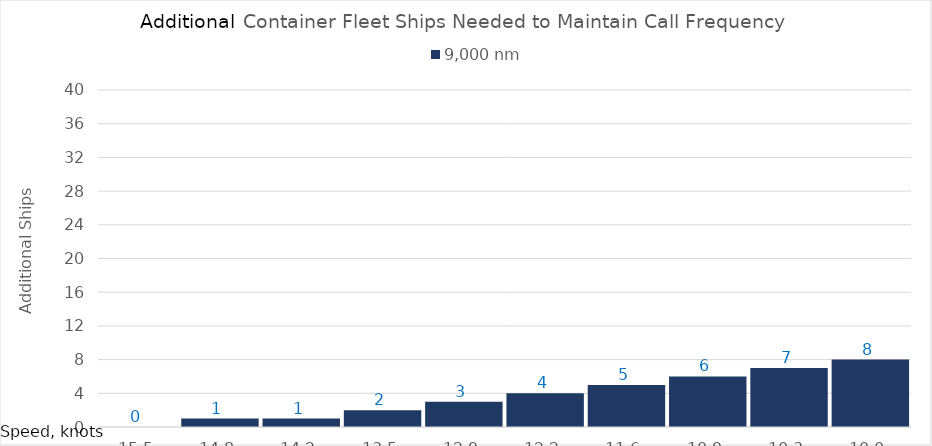
| Category | 9,000 |
|---|---|
| 15.450000000000001 | 0 |
| 14.8 | 1 |
| 14.15 | 1 |
| 13.5 | 2 |
| 12.85 | 3 |
| 12.2 | 4 |
| 11.549999999999999 | 5 |
| 10.899999999999999 | 6 |
| 10.249999999999998 | 7 |
| 10.0 | 8 |